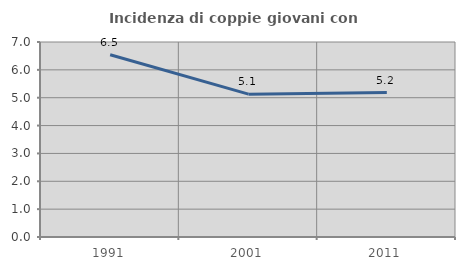
| Category | Incidenza di coppie giovani con figli |
|---|---|
| 1991.0 | 6.542 |
| 2001.0 | 5.128 |
| 2011.0 | 5.185 |